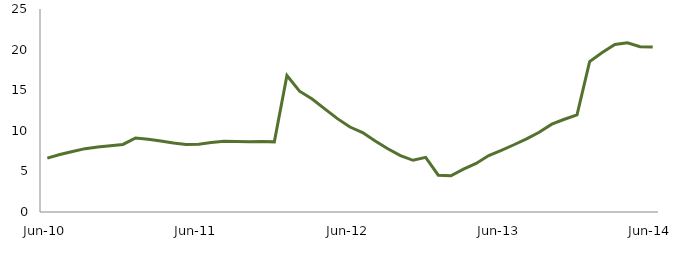
| Category | Series 0 |
|---|---|
| Jun-10 | 6.641 |
|  | 7.085 |
|  | 7.448 |
|  | 7.802 |
|  | 8.018 |
|  | 8.154 |
|  | 8.321 |
|  | 9.117 |
|  | 8.961 |
|  | 8.741 |
|  | 8.504 |
|  | 8.316 |
| Jun-11 | 8.351 |
|  | 8.556 |
|  | 8.708 |
|  | 8.67 |
|  | 8.643 |
|  | 8.672 |
|  | 8.638 |
|  | 16.809 |
|  | 14.88 |
|  | 13.91 |
|  | 12.702 |
|  | 11.496 |
| Jun-12 | 10.465 |
|  | 9.782 |
|  | 8.747 |
|  | 7.788 |
|  | 6.94 |
|  | 6.368 |
|  | 6.725 |
|  | 4.528 |
|  | 4.462 |
|  | 5.288 |
|  | 5.982 |
|  | 6.95 |
| Jun-13 | 7.6 |
|  | 8.282 |
|  | 9.007 |
|  | 9.818 |
|  | 10.818 |
|  | 11.424 |
|  | 11.963 |
|  | 18.523 |
|  | 19.632 |
|  | 20.625 |
|  | 20.848 |
|  | 20.351 |
| Jun-14 | 20.33 |